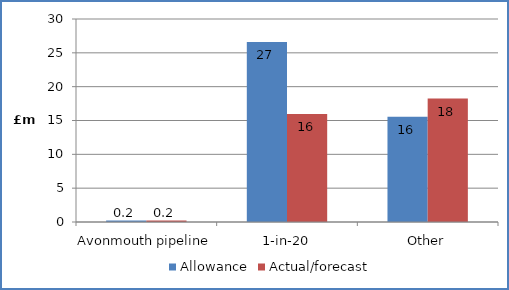
| Category | Allowance | Actual/forecast |
|---|---|---|
| Avonmouth pipeline | 0.225 | 0.225 |
| 1-in-20 | 26.602 | 15.975 |
| Other | 15.549 | 18.251 |